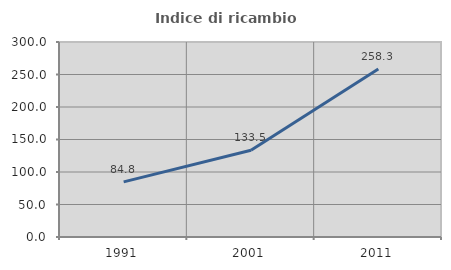
| Category | Indice di ricambio occupazionale  |
|---|---|
| 1991.0 | 84.81 |
| 2001.0 | 133.491 |
| 2011.0 | 258.333 |